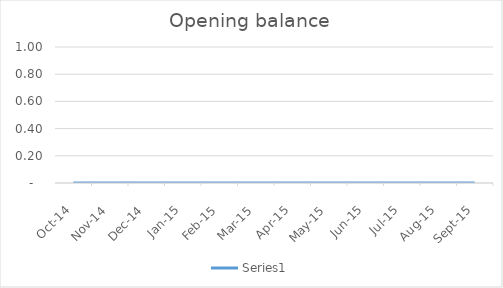
| Category | Series 0 |
|---|---|
| 2014-10-01 | 0 |
| 2014-11-01 | 0 |
| 2014-12-01 | 0 |
| 2015-01-01 | 0 |
| 2015-02-01 | 0 |
| 2015-03-01 | 0 |
| 2015-04-01 | 0 |
| 2015-05-01 | 0 |
| 2015-06-01 | 0 |
| 2015-07-01 | 0 |
| 2015-08-01 | 0 |
| 2015-09-01 | 0 |